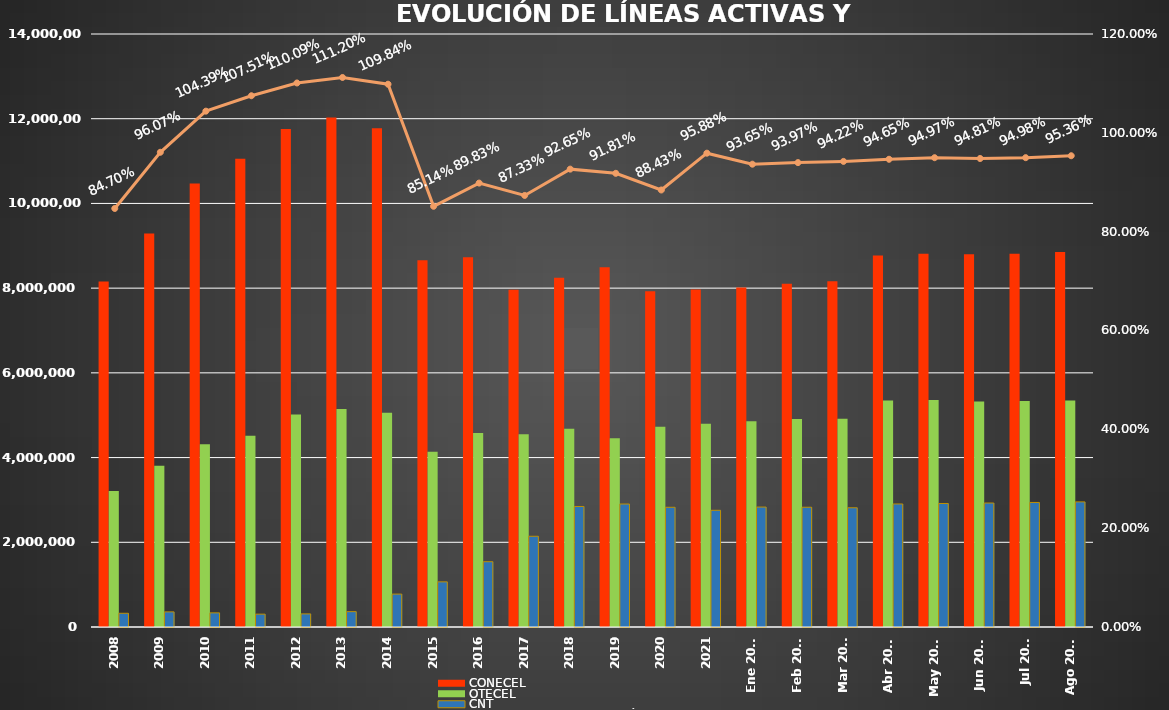
| Category | CONECEL | OTECEL | CNT |
|---|---|---|---|
| 2008 | 8156359 | 3211922 | 323967 |
| 2009 | 9291268 | 3806432 | 356900 |
| 2010 | 10470502 | 4314599 | 333730 |
| 2011 | 11057316 | 4513874 | 303368 |
| 2012 | 11757906 | 5019686 | 309271 |
| 2013 | 12030886 | 5148308 | 362560 |
| 2014 | 11772020 | 5055645 | 776892 |
| 2015 | 8658619 | 4134698 | 1065703 |
| 2016 | 8726823 | 4580092 | 1541219 |
| 2017 | 7960263 | 4549024 | 2142117 |
| 2018 | 8248050 | 4679646 | 2845142 |
| 2019 | 8493054 | 4456356 | 2903690 |
| 2020 | 7929253 | 4729725 | 2826388 |
| 2021 | 7965274 | 4800608 | 2755177 |
| Ene 2022 | 8012894 | 4856877 | 2831764 |
| Feb 2022 | 8103873 | 4909433 | 2827246 |
| Mar 2022 | 8163884 | 4915830 | 2814894 |
| Abr 2022 | 8773356 | 5349789 | 2904652 |
| May 2022 | 8810418 | 5358332 | 2916052 |
| Jun 2022 | 8802391 | 5326606 | 2926942 |
| Jul 2022 | 8811432 | 5334228 | 2940353 |
| Ago 2022 | 8855909 | 5345771 | 2954002 |